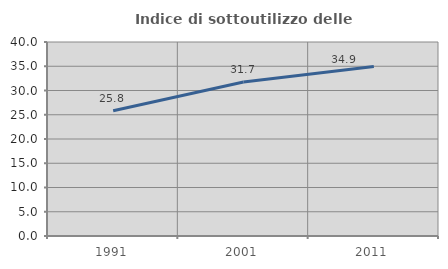
| Category | Indice di sottoutilizzo delle abitazioni  |
|---|---|
| 1991.0 | 25.84 |
| 2001.0 | 31.744 |
| 2011.0 | 34.942 |